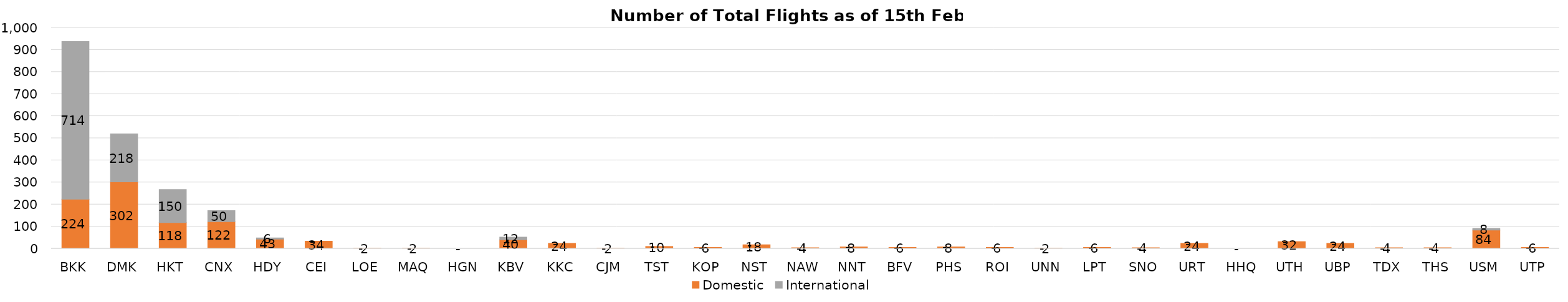
| Category | Domestic | International |
|---|---|---|
| BKK | 224 | 714 |
| DMK | 302 | 218 |
| HKT | 118 | 150 |
| CNX | 122 | 50 |
| HDY | 43 | 6 |
| CEI | 34 | 0 |
| LOE | 2 | 0 |
| MAQ | 2 | 0 |
| HGN | 0 | 0 |
| KBV | 40 | 12 |
| KKC | 24 | 0 |
| CJM | 2 | 0 |
| TST | 10 | 0 |
| KOP | 6 | 0 |
| NST | 18 | 0 |
| NAW | 4 | 0 |
| NNT | 8 | 0 |
| BFV | 6 | 0 |
| PHS | 8 | 0 |
| ROI | 6 | 0 |
| UNN | 2 | 0 |
| LPT | 6 | 0 |
| SNO | 4 | 0 |
| URT | 24 | 0 |
| HHQ | 0 | 0 |
| UTH | 32 | 0 |
| UBP | 24 | 0 |
| TDX | 4 | 0 |
| THS | 4 | 0 |
| USM | 84 | 8 |
| UTP | 6 | 0 |